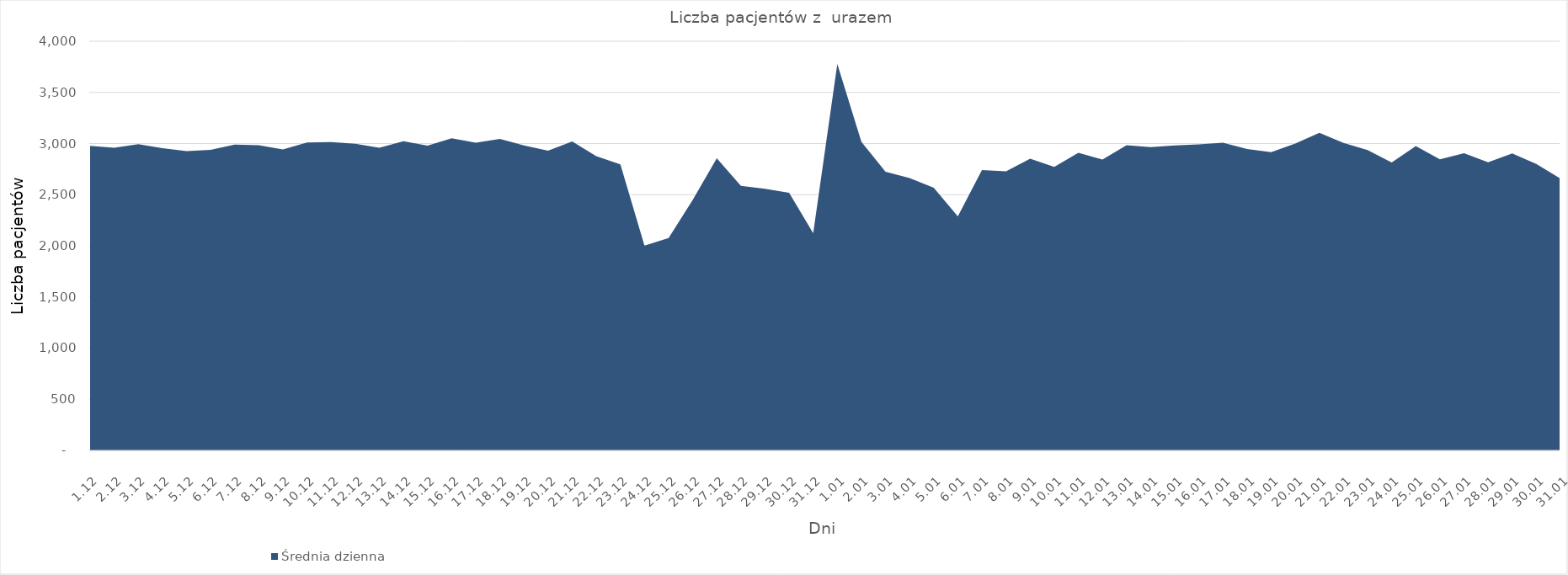
| Category | Średnia dzienna |
|---|---|
| 1.12 | 2977 |
| 2.12 | 2959.4 |
| 3.12 | 2993 |
| 4.12 | 2955 |
| 5.12 | 2925.9 |
| 6.12 | 2939.2 |
| 7.12 | 2990 |
| 8.12 | 2984 |
| 9.12 | 2941.9 |
| 10.12 | 3010.5 |
| 11.12 | 3015.3 |
| 12.12 | 2997.7 |
| 13.12 | 2958.1 |
| 14.12 | 3023.2 |
| 15.12 | 2979.1 |
| 16.12 | 3050.5 |
| 17.12 | 3007.9 |
| 18.12 | 3044.5 |
| 19.12 | 2980.6 |
| 20.12 | 2930.2 |
| 21.12 | 3019.7 |
| 22.12 | 2875.6 |
| 23.12 | 2796.3 |
| 24.12 | 2001.2 |
| 25.12 | 2076.5 |
| 26.12 | 2448.6 |
| 27.12 | 2856.3 |
| 28.12 | 2585.7 |
| 29.12 | 2557.8 |
| 30.12 | 2518.4 |
| 31.12 | 2123.9 |
| 1.01 | 3778.2 |
| 2.01 | 3016.1 |
| 3.01 | 2723.9 |
| 4.01 | 2662.2 |
| 5.01 | 2568.5 |
| 6.01 | 2287.7 |
| 7.01 | 2741.5 |
| 8.01 | 2728.4 |
| 9.01 | 2852.1 |
| 10.01 | 2772 |
| 11.01 | 2908.6 |
| 12.01 | 2842.6 |
| 13.01 | 2983.4 |
| 14.01 | 2964.9 |
| 15.01 | 2980.7 |
| 16.01 | 2991.7 |
| 17.01 | 3008.7 |
| 18.01 | 2945.5 |
| 19.01 | 2915.2 |
| 20.01 | 3000.1 |
| 21.01 | 3104.9 |
| 22.01 | 3006.2 |
| 23.01 | 2936.7 |
| 24.01 | 2815.6 |
| 25.01 | 2976.3 |
| 26.01 | 2845 |
| 27.01 | 2906.3 |
| 28.01 | 2816.7 |
| 29.01 | 2903.5 |
| 30.01 | 2801.1 |
| 31.01 | 2657.7 |